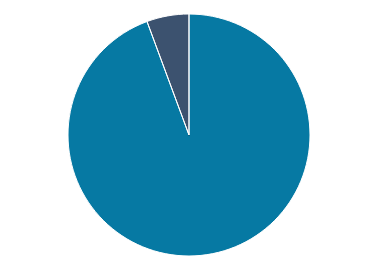
| Category | Series 0 |
|---|---|
| 0 | 1000000 |
| 1 | 59783.131 |